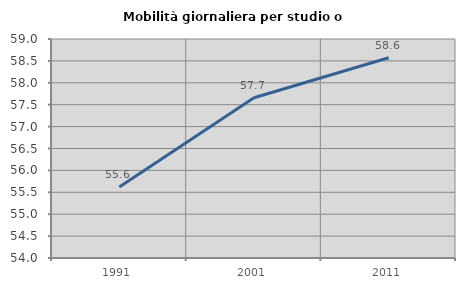
| Category | Mobilità giornaliera per studio o lavoro |
|---|---|
| 1991.0 | 55.622 |
| 2001.0 | 57.658 |
| 2011.0 | 58.571 |